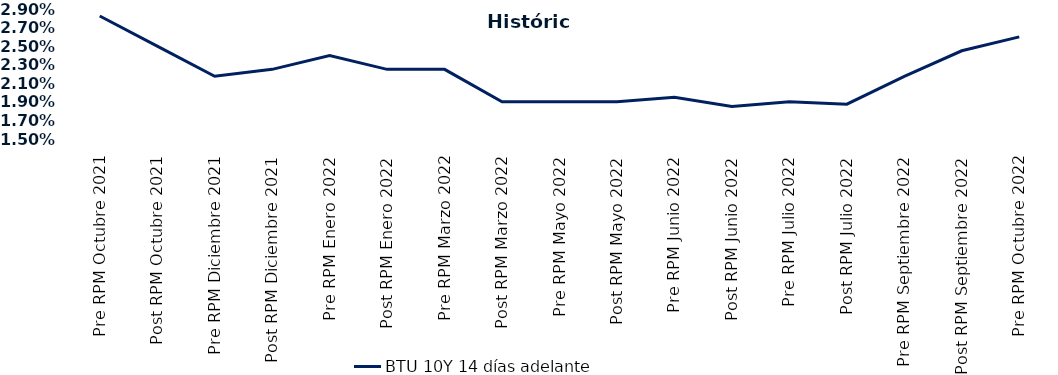
| Category | BTU 10Y 14 días adelante |
|---|---|
| Pre RPM Octubre 2021 | 0.028 |
| Post RPM Octubre 2021 | 0.025 |
| Pre RPM Diciembre 2021 | 0.022 |
| Post RPM Diciembre 2021 | 0.022 |
| Pre RPM Enero 2022 | 0.024 |
| Post RPM Enero 2022 | 0.022 |
| Pre RPM Marzo 2022 | 0.022 |
| Post RPM Marzo 2022 | 0.019 |
| Pre RPM Mayo 2022 | 0.019 |
| Post RPM Mayo 2022 | 0.019 |
| Pre RPM Junio 2022 | 0.02 |
| Post RPM Junio 2022 | 0.018 |
| Pre RPM Julio 2022 | 0.019 |
| Post RPM Julio 2022 | 0.019 |
| Pre RPM Septiembre 2022 | 0.022 |
| Post RPM Septiembre 2022 | 0.024 |
| Pre RPM Octubre 2022 | 0.026 |